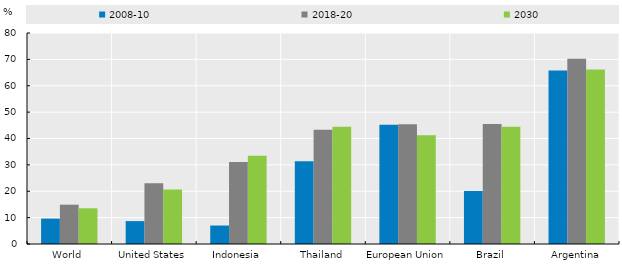
| Category | 2008-10 | 2018-20 | 2030 |
|---|---|---|---|
| World | 9.639 | 14.911 | 13.526 |
| United States | 8.68 | 23.038 | 20.642 |
| Indonesia | 7.006 | 31.078 | 33.491 |
| Thailand | 31.342 | 43.356 | 44.414 |
| European Union | 45.258 | 45.384 | 41.221 |
| Brazil | 20.134 | 45.452 | 44.42 |
| Argentina | 65.781 | 70.216 | 66.202 |